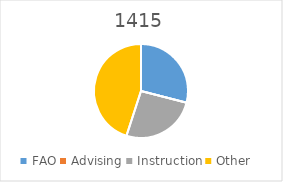
| Category | 1415 |
|---|---|
| FAO | 0.29 |
| Advising | 0 |
| Instruction | 0.26 |
| Other | 0.45 |